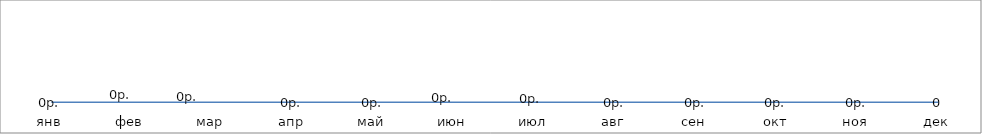
| Category | Затраты на рекламу |
|---|---|
| янв | 0 |
| фев | 0 |
| мар | 0 |
| апр | 0 |
| май | 0 |
| июн | 0 |
| июл | 0 |
| авг | 0 |
| сен | 0 |
| окт | 0 |
| ноя | 0 |
| дек | 0 |